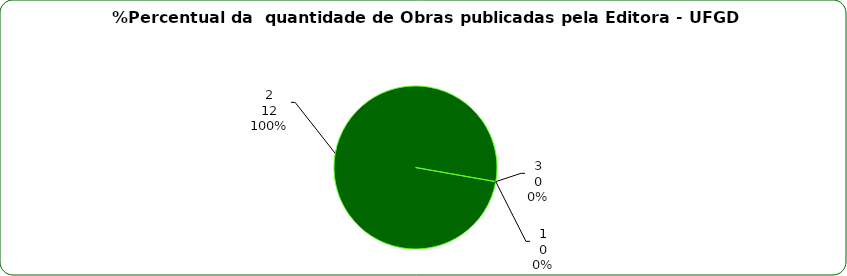
| Category | Series 0 |
|---|---|
| 0 | 0 |
| 1 | 12 |
| 2 | 0 |